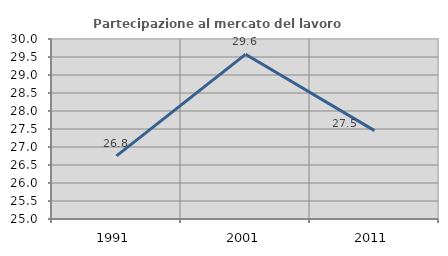
| Category | Partecipazione al mercato del lavoro  femminile |
|---|---|
| 1991.0 | 26.753 |
| 2001.0 | 29.575 |
| 2011.0 | 27.455 |